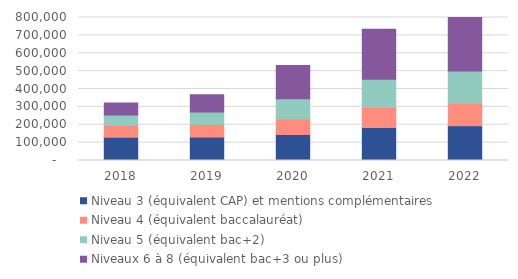
| Category | Niveau 3 (équivalent CAP) et mentions complémentaires | Niveau 4 (équivalent baccalauréat) | Niveau 5 (équivalent bac+2) | Niveaux 6 à 8 (équivalent bac+3 ou plus) |
|---|---|---|---|---|
| 2018.0 | 130624 | 64874 | 58547 | 66993 |
| 2019.0 | 132161 | 70579 | 68679 | 95855 |
| 2020.0 | 145095 | 86758 | 113838 | 185524 |
| 2021.0 | 183966 | 112616 | 158097 | 279720 |
| 2022.0 | 193992 | 126432 | 180812 | 328380 |